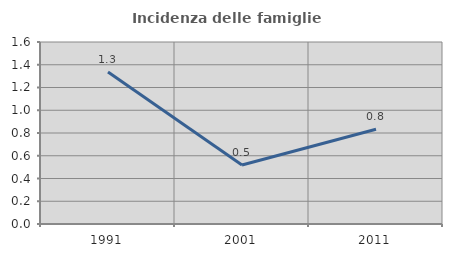
| Category | Incidenza delle famiglie numerose |
|---|---|
| 1991.0 | 1.337 |
| 2001.0 | 0.518 |
| 2011.0 | 0.833 |